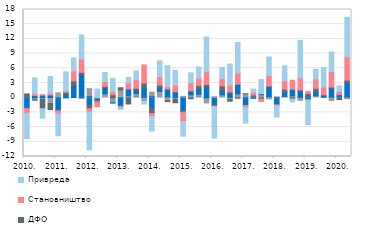
| Category | Непрофитне и друге организације | Локални ниво власти | Готов новац у oптицају | ДФО | Становништво | Привреда  |
|---|---|---|---|---|---|---|
| 2010. | 0.134 | 0.075 | -2.212 | 0.565 | -1 | -5.128 |
| II | -0.073 | -0.315 | 0.451 | -0.131 | 0.425 | 3.167 |
| III | -0.106 | -0.259 | 0.495 | -1.887 | 0.086 | -1.908 |
| IV | 0.046 | -1.116 | 0.496 | -1.321 | 0.383 | 3.372 |
| 2011. | 0.095 | 0.9 | -2.536 | -0.174 | -0.619 | -4.433 |
| II | -0.04 | -0.22 | 0.77 | 0.336 | 0.306 | 3.88 |
| III | 0.037 | -0.174 | 2.458 | 0.918 | 2.05 | 2.641 |
| IV | 0.061 | -0.361 | 4.615 | 0.505 | 2.742 | 4.901 |
| 2012. | 0.202 | 1.641 | -1.502 | -0.756 | -0.691 | -7.686 |
| II | 0.002 | -0.188 | -0.341 | -0.312 | -0.998 | 1.747 |
| III | 0.11 | 0.664 | 1.273 | 0.274 | 0.972 | 1.84 |
| IV | -0.138 | -0.873 | -0.098 | 0.61 | 0.594 | 2.749 |
| 2013. | 0.079 | 1.527 | -1.754 | 0.426 | -0.373 | -0.296 |
| II | 0.059 | 0.305 | 1.437 | -1.286 | 1.19 | 1.148 |
| III | 0.165 | 0.682 | 0.754 | 0.325 | 1.76 | 1.79 |
| IV | 0.076 | -0.87 | 1.873 | 1.027 | 3.718 | -0.415 |
| 2014. | 0.199 | 0.924 | -2.085 | -1.142 | -0.569 | -3.023 |
| II | 0.035 | 1.231 | 0.74 | 0.578 | 1.742 | 3.202 |
| III | 0.178 | -0.545 | 1.556 | -0.251 | 0.516 | 4.284 |
| IV | -0.104 | -0.237 | 1.19 | -0.68 | 1.391 | 3 |
| 2015. | -0.031 | 0.277 | -2.623 | -0.313 | -1.902 | -2.981 |
| II | 0.129 | 0.455 | 0.809 | -0.218 | 1.631 | 2.039 |
| III | 0.145 | 0.535 | 1.129 | 0.641 | 1.533 | 2.287 |
| IV | -0.109 | -1.155 | 2.237 | 0.437 | 2.676 | 7.032 |
| 2016. | 0.104 | -0.104 | -1.193 | -0.452 | -0.054 | -6.424 |
| II | -0.033 | 0.597 | 0.912 | 0.894 | 1.489 | 2.276 |
| III | 0.058 | -0.277 | 1.097 | -0.443 | 1.429 | 4.281 |
| IV | -0.001 | 0.781 | 1.984 | -0.118 | 2.31 | 6.213 |
| 2017. | 0.133 | 0.64 | -1.599 | 0.025 | -0.411 | -3.193 |
| II | 0.059 | 0.207 | -0.138 | 0.273 | 0.541 | 0.678 |
| III | 0.02 | 0.6 | 0.199 | -0.281 | -0.487 | 2.895 |
| IV | 0.183 | -0.435 | 2.116 | 0.066 | 2.148 | 3.798 |
| 2018. | -0.069 | 0.088 | -1.382 | 0.022 | -0.202 | -2.284 |
| II | 0.083 | 0.156 | 0.854 | 0.654 | 1.762 | 2.986 |
| III | 0.089 | 0.272 | 1.347 | -0.301 | 1.848 | -0.557 |
| IV | 0.082 | -0.727 | 1.258 | 0.234 | 2.481 | 7.641 |
| 2019. | 0.187 | 0.021 | -0.439 | 0.661 | 0.411 | -5.065 |
| II | -0.015 | 0.395 | 0.82 | 0.717 | 1.911 | 1.934 |
| III | 0.109 | -0.155 | 0.363 | 0.139 | 1.592 | 3.965 |
| IV | 0.106 | -0.756 | 1.801 | 0.269 | 3.171 | 3.974 |
| 2020. | -0.044 | 0.196 | 0.422 | -0.345 | 0.62 | 1.138 |
| II | 0.14 | -0.412 | 2.831 | 0.621 | 4.751 | 8.057 |